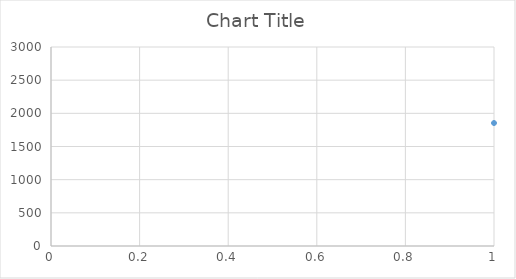
| Category | Series 0 |
|---|---|
| 0 | 1854 |
| 1 | 1859 |
| 2 | 1856 |
| 3 | 1899 |
| 4 | 1923 |
| 5 | 1927 |
| 6 | 1942 |
| 7 | 1959 |
| 8 | 1961 |
| 9 | 1969 |
| 10 | 1943 |
| 11 | 1936 |
| 12 | 1929 |
| 13 | 1915 |
| 14 | 1884 |
| 15 | 1865 |
| 16 | 1877 |
| 17 | 1883 |
| 18 | 1904 |
| 19 | 1916 |
| 20 | 1943 |
| 21 | 1959 |
| 22 | 1964 |
| 23 | 1975 |
| 24 | 1975 |
| 25 | 1976 |
| 26 | 1974 |
| 27 | 1999 |
| 28 | 1987 |
| 29 | 1920 |
| 30 | 1891 |
| 31 | 1886 |
| 32 | 1869 |
| 33 | 1853 |
| 34 | 1851 |
| 35 | 1857 |
| 36 | 1865 |
| 37 | 1874 |
| 38 | 1898 |
| 39 | 1900 |
| 40 | 1909 |
| 41 | 1895 |
| 42 | 1890 |
| 43 | 1916 |
| 44 | 1878 |
| 45 | 1858 |
| 46 | 1833 |
| 47 | 1812 |
| 48 | 1805 |
| 49 | 1791 |
| 50 | 1788 |
| 51 | 1774 |
| 52 | 1776 |
| 53 | 1780 |
| 54 | 1802 |
| 55 | 1821 |
| 56 | 1833 |
| 57 | 1838 |
| 58 | 1836 |
| 59 | 1831 |
| 60 | 1816 |
| 61 | 1807 |
| 62 | 1804 |
| 63 | 1768 |
| 64 | 1737 |
| 65 | 1733 |
| 66 | 1724 |
| 67 | 1722 |
| 68 | 1723 |
| 69 | 1752 |
| 70 | 1776 |
| 71 | 1778 |
| 72 | 1808 |
| 73 | 1810 |
| 74 | 1802 |
| 75 | 1805 |
| 76 | 1790 |
| 77 | 1761 |
| 78 | 1764 |
| 79 | 1782 |
| 80 | 1762 |
| 81 | 1724 |
| 82 | 1721 |
| 83 | 1732 |
| 84 | 1728 |
| 85 | 1735 |
| 86 | 1750 |
| 87 | 1771 |
| 88 | 1791 |
| 89 | 1794 |
| 90 | 1798 |
| 91 | 1805 |
| 92 | 1796 |
| 93 | 1795 |
| 94 | 1776 |
| 95 | 1746 |
| 96 | 1727 |
| 97 | 1718 |
| 98 | 1721 |
| 99 | 1732 |
| 100 | 1735 |
| 101 | 1737 |
| 102 | 1745 |
| 103 | 1761 |
| 104 | 1822 |
| 105 | 1837 |
| 106 | 1832 |
| 107 | 1831 |
| 108 | 1812 |
| 109 | 1801 |
| 110 | 1775 |
| 111 | 1762 |
| 112 | 1739 |
| 113 | 1729 |
| 114 | 1721 |
| 115 | 1716 |
| 116 | 1716 |
| 117 | 1729 |
| 118 | 1758 |
| 119 | 1764 |
| 120 | 1772 |
| 121 | 1784 |
| 122 | 1816 |
| 123 | 1827 |
| 124 | 1827 |
| 125 | 1805 |
| 126 | 1788 |
| 127 | 1782 |
| 128 | 1753 |
| 129 | 1758 |
| 130 | 1733 |
| 131 | 1720 |
| 132 | 1726 |
| 133 | 1765 |
| 134 | 1743 |
| 135 | 1762 |
| 136 | 1785 |
| 137 | 1809 |
| 138 | 1830 |
| 139 | 1819 |
| 140 | 1823 |
| 141 | 1826 |
| 142 | 1810 |
| 143 | 1787 |
| 144 | 1765 |
| 145 | 1739 |
| 146 | 1718 |
| 147 | 1707 |
| 148 | 1691 |
| 149 | 1714 |
| 150 | 1720 |
| 151 | 1721 |
| 152 | 1730 |
| 153 | 1775 |
| 154 | 1810 |
| 155 | 1824 |
| 156 | 1821 |
| 157 | 1815 |
| 158 | 1808 |
| 159 | 1789 |
| 160 | 1782 |
| 161 | 1750 |
| 162 | 1723 |
| 163 | 1713 |
| 164 | 1706 |
| 165 | 1708 |
| 166 | 1719 |
| 167 | 1728 |
| 168 | 1736 |
| 169 | 1756 |
| 170 | 1785 |
| 171 | 1781 |
| 172 | 1794 |
| 173 | 1782 |
| 174 | 1783 |
| 175 | 1772 |
| 176 | 1763 |
| 177 | 1742 |
| 178 | 1719 |
| 179 | 1701 |
| 180 | 1687 |
| 181 | 1692 |
| 182 | 1688 |
| 183 | 1721 |
| 184 | 1710 |
| 185 | 1730 |
| 186 | 1756 |
| 187 | 1790 |
| 188 | 1791 |
| 189 | 1775 |
| 190 | 1774 |
| 191 | 1772 |
| 192 | 1754 |
| 193 | 1736 |
| 194 | 1720 |
| 195 | 1704 |
| 196 | 1674 |
| 197 | 1661 |
| 198 | 1668 |
| 199 | 1679 |
| 200 | 1720 |
| 201 | 1731 |
| 202 | 1731 |
| 203 | 1738 |
| 204 | 1756 |
| 205 | 1766 |
| 206 | 1770 |
| 207 | 1771 |
| 208 | 1749 |
| 209 | 1755 |
| 210 | 1708 |
| 211 | 1708 |
| 212 | 1687 |
| 213 | 1662 |
| 214 | 1676 |
| 215 | 1657 |
| 216 | 1667 |
| 217 | 1686 |
| 218 | 1708 |
| 219 | 1743 |
| 220 | 1747 |
| 221 | 1743 |
| 222 | 1762 |
| 223 | 1765 |
| 224 | 1746 |
| 225 | 1723 |
| 226 | 1713 |
| 227 | 1698 |
| 228 | 1671 |
| 229 | 1654 |
| 230 | 1662 |
| 231 | 1679 |
| 232 | 1671 |
| 233 | 1677 |
| 234 | 1702 |
| 235 | 1718 |
| 236 | 1738 |
| 237 | 1742 |
| 238 | 1737 |
| 239 | 1736 |
| 240 | 1733 |
| 241 | 1721 |
| 242 | 1733 |
| 243 | 1730 |
| 244 | 1714 |
| 245 | 1679 |
| 246 | 1654 |
| 247 | 1649 |
| 248 | 1653 |
| 249 | 1666 |
| 250 | 1686 |
| 251 | 1704 |
| 252 | 1723 |
| 253 | 1735 |
| 254 | 1737 |
| 255 | 1745 |
| 256 | 1750 |
| 257 | 1739 |
| 258 | 1733 |
| 259 | 1712 |
| 260 | 1692 |
| 261 | 1664 |
| 262 | 1632 |
| 263 | 1636 |
| 264 | 1633 |
| 265 | 1661 |
| 266 | 1669 |
| 267 | 1679 |
| 268 | 1691 |
| 269 | 1731 |
| 270 | 1730 |
| 271 | 1729 |
| 272 | 1743 |
| 273 | 1750 |
| 274 | 1737 |
| 275 | 1714 |
| 276 | 1694 |
| 277 | 1667 |
| 278 | 1647 |
| 279 | 1628 |
| 280 | 1646 |
| 281 | 1644 |
| 282 | 1651 |
| 283 | 1667 |
| 284 | 1677 |
| 285 | 1699 |
| 286 | 1734 |
| 287 | 1766 |
| 288 | 1777 |
| 289 | 1758 |
| 290 | 1728 |
| 291 | 1704 |
| 292 | 1705 |
| 293 | 1704 |
| 294 | 1658 |
| 295 | 1655 |
| 296 | 1669 |
| 297 | 1656 |
| 298 | 1658 |
| 299 | 1666 |
| 300 | 1657 |
| 301 | 1683 |
| 302 | 1708 |
| 303 | 1745 |
| 304 | 1739 |
| 305 | 1735 |
| 306 | 1729 |
| 307 | 1707 |
| 308 | 1675 |
| 309 | 1658 |
| 310 | 1660 |
| 311 | 1658 |
| 312 | 1665 |
| 313 | 1658 |
| 314 | 1667 |
| 315 | 1671 |
| 316 | 1685 |
| 317 | 1696 |
| 318 | 1716 |
| 319 | 1720 |
| 320 | 1743 |
| 321 | 1772 |
| 322 | 1775 |
| 323 | 1771 |
| 324 | 1766 |
| 325 | 1735 |
| 326 | 1748 |
| 327 | 1738 |
| 328 | 1725 |
| 329 | 1705 |
| 330 | 1724 |
| 331 | 1747 |
| 332 | 1759 |
| 333 | 1780 |
| 334 | 1807 |
| 335 | 1812 |
| 336 | 1825 |
| 337 | 1838 |
| 338 | 1838 |
| 339 | 1854 |
| 340 | 1849 |
| 341 | 1845 |
| 342 | 1819 |
| 343 | 1812 |
| 344 | 1793 |
| 345 | 1783 |
| 346 | 1799 |
| 347 | 1804 |
| 348 | 1805 |
| 349 | 1814 |
| 350 | 1814 |
| 351 | 1885 |
| 352 | 1838 |
| 353 | 1855 |
| 354 | 1836 |
| 355 | 1823 |
| 356 | 1791 |
| 357 | 1776 |
| 358 | 1739 |
| 359 | 1735 |
| 360 | 1745 |
| 361 | 1701 |
| 362 | 1683 |
| 363 | 1696 |
| 364 | 1732 |
| 365 | 1727 |
| 366 | 1759 |
| 367 | 1766 |
| 368 | 1775 |
| 369 | 1786 |
| 370 | 1787 |
| 371 | 1758 |
| 372 | 1754 |
| 373 | 1721 |
| 374 | 1691 |
| 375 | 1671 |
| 376 | 1650 |
| 377 | 1630 |
| 378 | 1626 |
| 379 | 1610 |
| 380 | 1633 |
| 381 | 1625 |
| 382 | 1644 |
| 383 | 1668 |
| 384 | 1693 |
| 385 | 1695 |
| 386 | 1700 |
| 387 | 1700 |
| 388 | 1694 |
| 389 | 1696 |
| 390 | 1668 |
| 391 | 1649 |
| 392 | 1617 |
| 393 | 1600 |
| 394 | 1600 |
| 395 | 1608 |
| 396 | 1605 |
| 397 | 1630 |
| 398 | 1640 |
| 399 | 1643 |
| 400 | 1655 |
| 401 | 1669 |
| 402 | 1678 |
| 403 | 1694 |
| 404 | 1712 |
| 405 | 1700 |
| 406 | 1694 |
| 407 | 1667 |
| 408 | 1646 |
| 409 | 1630 |
| 410 | 1606 |
| 411 | 1592 |
| 412 | 1584 |
| 413 | 1611 |
| 414 | 1607 |
| 415 | 1626 |
| 416 | 1653 |
| 417 | 1673 |
| 418 | 1691 |
| 419 | 1698 |
| 420 | 1678 |
| 421 | 1679 |
| 422 | 1671 |
| 423 | 1659 |
| 424 | 1646 |
| 425 | 1613 |
| 426 | 1598 |
| 427 | 1595 |
| 428 | 1584 |
| 429 | 1584 |
| 430 | 1613 |
| 431 | 1662 |
| 432 | 1663 |
| 433 | 1713 |
| 434 | 1726 |
| 435 | 1737 |
| 436 | 1775 |
| 437 | 1796 |
| 438 | 1803 |
| 439 | 1828 |
| 440 | 1897 |
| 441 | 1934 |
| 442 | 1965 |
| 443 | 2027 |
| 444 | 2104 |
| 445 | 2174 |
| 446 | 2248 |
| 447 | 2318 |
| 448 | 2404 |
| 449 | 2513 |
| 450 | 2580 |
| 451 | 2679 |
| 452 | 2783 |
| 453 | 2833 |
| 454 | 2845 |
| 455 | 2800 |
| 456 | 2700 |
| 457 | 2592 |
| 458 | 2484 |
| 459 | 2386 |
| 460 | 2223 |
| 461 | 2074 |
| 462 | 1942 |
| 463 | 1839 |
| 464 | 1782 |
| 465 | 1751 |
| 466 | 1729 |
| 467 | 1757 |
| 468 | 1788 |
| 469 | 1783 |
| 470 | 1777 |
| 471 | 1779 |
| 472 | 1789 |
| 473 | 1798 |
| 474 | 1778 |
| 475 | 1745 |
| 476 | 1722 |
| 477 | 1716 |
| 478 | 1723 |
| 479 | 1737 |
| 480 | 1750 |
| 481 | 1762 |
| 482 | 1782 |
| 483 | 1799 |
| 484 | 1818 |
| 485 | 1820 |
| 486 | 1814 |
| 487 | 1807 |
| 488 | 1788 |
| 489 | 1779 |
| 490 | 1765 |
| 491 | 1743 |
| 492 | 1725 |
| 493 | 1708 |
| 494 | 1697 |
| 495 | 1692 |
| 496 | 1704 |
| 497 | 1717 |
| 498 | 1729 |
| 499 | 1759 |
| 500 | 1760 |
| 501 | 1778 |
| 502 | 1780 |
| 503 | 1779 |
| 504 | 1769 |
| 505 | 1760 |
| 506 | 1739 |
| 507 | 1719 |
| 508 | 1708 |
| 509 | 1698 |
| 510 | 1680 |
| 511 | 1676 |
| 512 | 1692 |
| 513 | 1706 |
| 514 | 1743 |
| 515 | 1760 |
| 516 | 1771 |
| 517 | 1781 |
| 518 | 1782 |
| 519 | 1783 |
| 520 | 1770 |
| 521 | 1782 |
| 522 | 1766 |
| 523 | 1721 |
| 524 | 1696 |
| 525 | 1688 |
| 526 | 1683 |
| 527 | 1679 |
| 528 | 1700 |
| 529 | 1717 |
| 530 | 1728 |
| 531 | 1742 |
| 532 | 1735 |
| 533 | 1764 |
| 534 | 1772 |
| 535 | 1779 |
| 536 | 1789 |
| 537 | 1789 |
| 538 | 1777 |
| 539 | 1752 |
| 540 | 1720 |
| 541 | 1712 |
| 542 | 1703 |
| 543 | 1707 |
| 544 | 1706 |
| 545 | 1714 |
| 546 | 1738 |
| 547 | 1733 |
| 548 | 1755 |
| 549 | 1783 |
| 550 | 1803 |
| 551 | 1798 |
| 552 | 1791 |
| 553 | 1792 |
| 554 | 1789 |
| 555 | 1775 |
| 556 | 1755 |
| 557 | 1742 |
| 558 | 1729 |
| 559 | 1719 |
| 560 | 1725 |
| 561 | 1714 |
| 562 | 1742 |
| 563 | 1771 |
| 564 | 1785 |
| 565 | 1787 |
| 566 | 1810 |
| 567 | 1827 |
| 568 | 1821 |
| 569 | 1820 |
| 570 | 1799 |
| 571 | 1779 |
| 572 | 1762 |
| 573 | 1766 |
| 574 | 1774 |
| 575 | 1754 |
| 576 | 1730 |
| 577 | 1729 |
| 578 | 1745 |
| 579 | 1770 |
| 580 | 1779 |
| 581 | 1813 |
| 582 | 1833 |
| 583 | 1832 |
| 584 | 1841 |
| 585 | 1849 |
| 586 | 1849 |
| 587 | 1851 |
| 588 | 1817 |
| 589 | 1820 |
| 590 | 1795 |
| 591 | 1783 |
| 592 | 1761 |
| 593 | 1752 |
| 594 | 1754 |
| 595 | 1770 |
| 596 | 1791 |
| 597 | 1804 |
| 598 | 1835 |
| 599 | 1844 |
| 600 | 1867 |
| 601 | 1882 |
| 602 | 1869 |
| 603 | 1855 |
| 604 | 1828 |
| 605 | 1822 |
| 606 | 1800 |
| 607 | 1769 |
| 608 | 1766 |
| 609 | 1795 |
| 610 | 1793 |
| 611 | 1798 |
| 612 | 1820 |
| 613 | 1828 |
| 614 | 1865 |
| 615 | 1882 |
| 616 | 1889 |
| 617 | 1898 |
| 618 | 1899 |
| 619 | 1888 |
| 620 | 1875 |
| 621 | 1852 |
| 622 | 1845 |
| 623 | 1842 |
| 624 | 1843 |
| 625 | 1822 |
| 626 | 1819 |
| 627 | 1836 |
| 628 | 1817 |
| 629 | 1841 |
| 630 | 1872 |
| 631 | 1891 |
| 632 | 1904 |
| 633 | 1929 |
| 634 | 1950 |
| 635 | 1948 |
| 636 | 1938 |
| 637 | 1912 |
| 638 | 1890 |
| 639 | 1867 |
| 640 | 1852 |
| 641 | 1849 |
| 642 | 1842 |
| 643 | 1845 |
| 644 | 1855 |
| 645 | 1867 |
| 646 | 1885 |
| 647 | 1903 |
| 648 | 1928 |
| 649 | 1946 |
| 650 | 1961 |
| 651 | 1949 |
| 652 | 1949 |
| 653 | 1941 |
| 654 | 1924 |
| 655 | 1900 |
| 656 | 1871 |
| 657 | 1847 |
| 658 | 1837 |
| 659 | 1848 |
| 660 | 1887 |
| 661 | 1903 |
| 662 | 1935 |
| 663 | 1939 |
| 664 | 1932 |
| 665 | 1952 |
| 666 | 1945 |
| 667 | 1942 |
| 668 | 1945 |
| 669 | 1920 |
| 670 | 1891 |
| 671 | 1878 |
| 672 | 1866 |
| 673 | 1836 |
| 674 | 1828 |
| 675 | 1817 |
| 676 | 1816 |
| 677 | 1816 |
| 678 | 1825 |
| 679 | 1827 |
| 680 | 1836 |
| 681 | 1849 |
| 682 | 1851 |
| 683 | 1848 |
| 684 | 1846 |
| 685 | 1835 |
| 686 | 1791 |
| 687 | 1775 |
| 688 | 1765 |
| 689 | 1745 |
| 690 | 1720 |
| 691 | 1700 |
| 692 | 1707 |
| 693 | 1720 |
| 694 | 1716 |
| 695 | 1727 |
| 696 | 1741 |
| 697 | 1737 |
| 698 | 1755 |
| 699 | 1764 |
| 700 | 1755 |
| 701 | 1765 |
| 702 | 1771 |
| 703 | 1733 |
| 704 | 1706 |
| 705 | 1683 |
| 706 | 1660 |
| 707 | 1650 |
| 708 | 1664 |
| 709 | 1666 |
| 710 | 1653 |
| 711 | 1667 |
| 712 | 1694 |
| 713 | 1701 |
| 714 | 1703 |
| 715 | 1726 |
| 716 | 1721 |
| 717 | 1728 |
| 718 | 1720 |
| 719 | 1702 |
| 720 | 1697 |
| 721 | 1678 |
| 722 | 1661 |
| 723 | 1646 |
| 724 | 1632 |
| 725 | 1637 |
| 726 | 1652 |
| 727 | 1659 |
| 728 | 1659 |
| 729 | 1675 |
| 730 | 1716 |
| 731 | 1745 |
| 732 | 1736 |
| 733 | 1733 |
| 734 | 1726 |
| 735 | 1703 |
| 736 | 1685 |
| 737 | 1667 |
| 738 | 1641 |
| 739 | 1631 |
| 740 | 1645 |
| 741 | 1643 |
| 742 | 1650 |
| 743 | 1657 |
| 744 | 1671 |
| 745 | 1683 |
| 746 | 1698 |
| 747 | 1717 |
| 748 | 1735 |
| 749 | 1741 |
| 750 | 1722 |
| 751 | 1716 |
| 752 | 1727 |
| 753 | 1714 |
| 754 | 1708 |
| 755 | 1677 |
| 756 | 1648 |
| 757 | 1645 |
| 758 | 1642 |
| 759 | 1637 |
| 760 | 1656 |
| 761 | 1690 |
| 762 | 1722 |
| 763 | 1741 |
| 764 | 1730 |
| 765 | 1740 |
| 766 | 1746 |
| 767 | 1735 |
| 768 | 1714 |
| 769 | 1716 |
| 770 | 1687 |
| 771 | 1660 |
| 772 | 1646 |
| 773 | 1634 |
| 774 | 1643 |
| 775 | 1645 |
| 776 | 1650 |
| 777 | 1687 |
| 778 | 1719 |
| 779 | 1729 |
| 780 | 1733 |
| 781 | 1737 |
| 782 | 1752 |
| 783 | 1750 |
| 784 | 1721 |
| 785 | 1704 |
| 786 | 1683 |
| 787 | 1660 |
| 788 | 1641 |
| 789 | 1637 |
| 790 | 1643 |
| 791 | 1637 |
| 792 | 1647 |
| 793 | 1667 |
| 794 | 1682 |
| 795 | 1705 |
| 796 | 1717 |
| 797 | 1719 |
| 798 | 1720 |
| 799 | 1730 |
| 800 | 1713 |
| 801 | 1711 |
| 802 | 1685 |
| 803 | 1664 |
| 804 | 1656 |
| 805 | 1637 |
| 806 | 1639 |
| 807 | 1620 |
| 808 | 1641 |
| 809 | 1647 |
| 810 | 1657 |
| 811 | 1729 |
| 812 | 1702 |
| 813 | 1718 |
| 814 | 1721 |
| 815 | 1717 |
| 816 | 1707 |
| 817 | 1691 |
| 818 | 1713 |
| 819 | 1695 |
| 820 | 1660 |
| 821 | 1637 |
| 822 | 1623 |
| 823 | 1632 |
| 824 | 1633 |
| 825 | 1627 |
| 826 | 1635 |
| 827 | 1662 |
| 828 | 1673 |
| 829 | 1700 |
| 830 | 1717 |
| 831 | 1730 |
| 832 | 1713 |
| 833 | 1700 |
| 834 | 1689 |
| 835 | 1665 |
| 836 | 1636 |
| 837 | 1622 |
| 838 | 1611 |
| 839 | 1611 |
| 840 | 1611 |
| 841 | 1640 |
| 842 | 1658 |
| 843 | 1662 |
| 844 | 1672 |
| 845 | 1687 |
| 846 | 1704 |
| 847 | 1706 |
| 848 | 1708 |
| 849 | 1696 |
| 850 | 1691 |
| 851 | 1672 |
| 852 | 1654 |
| 853 | 1621 |
| 854 | 1600 |
| 855 | 1590 |
| 856 | 1607 |
| 857 | 1625 |
| 858 | 1646 |
| 859 | 1650 |
| 860 | 1678 |
| 861 | 1679 |
| 862 | 1704 |
| 863 | 1698 |
| 864 | 1662 |
| 865 | 1683 |
| 866 | 1693 |
| 867 | 1664 |
| 868 | 1646 |
| 869 | 1637 |
| 870 | 1631 |
| 871 | 1618 |
| 872 | 1617 |
| 873 | 1625 |
| 874 | 1619 |
| 875 | 1642 |
| 876 | 1638 |
| 877 | 1659 |
| 878 | 1685 |
| 879 | 1696 |
| 880 | 1696 |
| 881 | 1698 |
| 882 | 1710 |
| 883 | 1697 |
| 884 | 1675 |
| 885 | 1640 |
| 886 | 1617 |
| 887 | 1610 |
| 888 | 1597 |
| 889 | 1593 |
| 890 | 1598 |
| 891 | 1617 |
| 892 | 1621 |
| 893 | 1637 |
| 894 | 1647 |
| 895 | 1696 |
| 896 | 1700 |
| 897 | 1696 |
| 898 | 1695 |
| 899 | 1681 |
| 900 | 1663 |
| 901 | 1648 |
| 902 | 1630 |
| 903 | 1611 |
| 904 | 1597 |
| 905 | 1582 |
| 906 | 1592 |
| 907 | 1596 |
| 908 | 1606 |
| 909 | 1658 |
| 910 | 1679 |
| 911 | 1687 |
| 912 | 1704 |
| 913 | 1688 |
| 914 | 1695 |
| 915 | 1689 |
| 916 | 1678 |
| 917 | 1660 |
| 918 | 1633 |
| 919 | 1620 |
| 920 | 1598 |
| 921 | 1598 |
| 922 | 1591 |
| 923 | 1606 |
| 924 | 1609 |
| 925 | 1619 |
| 926 | 1634 |
| 927 | 1643 |
| 928 | 1679 |
| 929 | 1717 |
| 930 | 1697 |
| 931 | 1694 |
| 932 | 1688 |
| 933 | 1682 |
| 934 | 1666 |
| 935 | 1633 |
| 936 | 1604 |
| 937 | 1589 |
| 938 | 1576 |
| 939 | 1580 |
| 940 | 1585 |
| 941 | 1613 |
| 942 | 1670 |
| 943 | 1673 |
| 944 | 1671 |
| 945 | 1676 |
| 946 | 1685 |
| 947 | 1675 |
| 948 | 1679 |
| 949 | 1653 |
| 950 | 1643 |
| 951 | 1630 |
| 952 | 1630 |
| 953 | 1600 |
| 954 | 1585 |
| 955 | 1590 |
| 956 | 1606 |
| 957 | 1621 |
| 958 | 1623 |
| 959 | 1642 |
| 960 | 1653 |
| 961 | 1658 |
| 962 | 1685 |
| 963 | 1687 |
| 964 | 1674 |
| 965 | 1683 |
| 966 | 1672 |
| 967 | 1643 |
| 968 | 1617 |
| 969 | 1600 |
| 970 | 1597 |
| 971 | 1581 |
| 972 | 1596 |
| 973 | 1600 |
| 974 | 1613 |
| 975 | 1645 |
| 976 | 1662 |
| 977 | 1687 |
| 978 | 1708 |
| 979 | 1710 |
| 980 | 1695 |
| 981 | 1685 |
| 982 | 1691 |
| 983 | 1684 |
| 984 | 1681 |
| 985 | 1683 |
| 986 | 1670 |
| 987 | 1657 |
| 988 | 1647 |
| 989 | 1658 |
| 990 | 1676 |
| 991 | 1710 |
| 992 | 1738 |
| 993 | 1745 |
| 994 | 1771 |
| 995 | 1791 |
| 996 | 1791 |
| 997 | 1785 |
| 998 | 1788 |
| 999 | 1791 |
| 1000 | 1775 |
| 1001 | 1752 |
| 1002 | 1755 |
| 1003 | 1740 |
| 1004 | 1745 |
| 1005 | 1748 |
| 1006 | 1749 |
| 1007 | 1767 |
| 1008 | 1762 |
| 1009 | 1772 |
| 1010 | 1790 |
| 1011 | 1808 |
| 1012 | 1832 |
| 1013 | 1830 |
| 1014 | 1795 |
| 1015 | 1778 |
| 1016 | 1744 |
| 1017 | 1704 |
| 1018 | 1726 |
| 1019 | 1685 |
| 1020 | 1671 |
| 1021 | 1670 |
| 1022 | 1667 |
| 1023 | 1674 |
| 1024 | 1679 |
| 1025 | 1733 |
| 1026 | 1745 |
| 1027 | 1749 |
| 1028 | 1751 |
| 1029 | 1744 |
| 1030 | 1734 |
| 1031 | 1712 |
| 1032 | 1688 |
| 1033 | 1655 |
| 1034 | 1640 |
| 1035 | 1612 |
| 1036 | 1597 |
| 1037 | 1584 |
| 1038 | 1592 |
| 1039 | 1595 |
| 1040 | 1604 |
| 1041 | 1613 |
| 1042 | 1631 |
| 1043 | 1642 |
| 1044 | 1648 |
| 1045 | 1662 |
| 1046 | 1650 |
| 1047 | 1632 |
| 1048 | 1637 |
| 1049 | 1663 |
| 1050 | 1614 |
| 1051 | 1575 |
| 1052 | 1572 |
| 1053 | 1577 |
| 1054 | 1567 |
| 1055 | 1566 |
| 1056 | 1578 |
| 1057 | 1604 |
| 1058 | 1619 |
| 1059 | 1653 |
| 1060 | 1646 |
| 1061 | 1654 |
| 1062 | 1650 |
| 1063 | 1637 |
| 1064 | 1634 |
| 1065 | 1630 |
| 1066 | 1596 |
| 1067 | 1566 |
| 1068 | 1559 |
| 1069 | 1550 |
| 1070 | 1532 |
| 1071 | 1536 |
| 1072 | 1550 |
| 1073 | 1578 |
| 1074 | 1611 |
| 1075 | 1639 |
| 1076 | 1638 |
| 1077 | 1641 |
| 1078 | 1643 |
| 1079 | 1640 |
| 1080 | 1621 |
| 1081 | 1609 |
| 1082 | 1602 |
| 1083 | 1579 |
| 1084 | 1558 |
| 1085 | 1555 |
| 1086 | 1546 |
| 1087 | 1542 |
| 1088 | 1546 |
| 1089 | 1553 |
| 1090 | 1560 |
| 1091 | 1596 |
| 1092 | 1622 |
| 1093 | 1652 |
| 1094 | 1668 |
| 1095 | 1667 |
| 1096 | 1678 |
| 1097 | 1693 |
| 1098 | 1690 |
| 1099 | 1705 |
| 1100 | 1740 |
| 1101 | 1791 |
| 1102 | 1833 |
| 1103 | 1908 |
| 1104 | 1991 |
| 1105 | 2098 |
| 1106 | 2206 |
| 1107 | 2277 |
| 1108 | 2360 |
| 1109 | 2426 |
| 1110 | 2497 |
| 1111 | 2558 |
| 1112 | 2642 |
| 1113 | 2720 |
| 1114 | 2779 |
| 1115 | 2776 |
| 1116 | 2699 |
| 1117 | 2610 |
| 1118 | 2492 |
| 1119 | 2397 |
| 1120 | 2284 |
| 1121 | 2144 |
| 1122 | 2004 |
| 1123 | 1911 |
| 1124 | 1839 |
| 1125 | 1812 |
| 1126 | 1758 |
| 1127 | 1737 |
| 1128 | 1754 |
| 1129 | 1723 |
| 1130 | 1707 |
| 1131 | 1694 |
| 1132 | 1699 |
| 1133 | 1704 |
| 1134 | 1688 |
| 1135 | 1678 |
| 1136 | 1683 |
| 1137 | 1677 |
| 1138 | 1679 |
| 1139 | 1700 |
| 1140 | 1709 |
| 1141 | 1743 |
| 1142 | 1781 |
| 1143 | 1787 |
| 1144 | 1775 |
| 1145 | 1762 |
| 1146 | 1746 |
| 1147 | 1724 |
| 1148 | 1698 |
| 1149 | 1665 |
| 1150 | 1659 |
| 1151 | 1653 |
| 1152 | 1646 |
| 1153 | 1626 |
| 1154 | 1639 |
| 1155 | 1637 |
| 1156 | 1666 |
| 1157 | 1692 |
| 1158 | 1697 |
| 1159 | 1702 |
| 1160 | 1700 |
| 1161 | 1713 |
| 1162 | 1676 |
| 1163 | 1685 |
| 1164 | 1675 |
| 1165 | 1655 |
| 1166 | 1629 |
| 1167 | 1630 |
| 1168 | 1627 |
| 1169 | 1607 |
| 1170 | 1606 |
| 1171 | 1630 |
| 1172 | 1651 |
| 1173 | 1665 |
| 1174 | 1675 |
| 1175 | 1696 |
| 1176 | 1700 |
| 1177 | 1707 |
| 1178 | 1694 |
| 1179 | 1677 |
| 1180 | 1668 |
| 1181 | 1633 |
| 1182 | 1627 |
| 1183 | 1614 |
| 1184 | 1615 |
| 1185 | 1610 |
| 1186 | 1600 |
| 1187 | 1617 |
| 1188 | 1635 |
| 1189 | 1649 |
| 1190 | 1683 |
| 1191 | 1694 |
| 1192 | 1716 |
| 1193 | 1711 |
| 1194 | 1708 |
| 1195 | 1697 |
| 1196 | 1678 |
| 1197 | 1671 |
| 1198 | 1630 |
| 1199 | 1626 |
| 1200 | 1610 |
| 1201 | 1608 |
| 1202 | 1600 |
| 1203 | 1629 |
| 1204 | 1639 |
| 1205 | 1643 |
| 1206 | 1659 |
| 1207 | 1669 |
| 1208 | 1687 |
| 1209 | 1694 |
| 1210 | 1702 |
| 1211 | 1692 |
| 1212 | 1680 |
| 1213 | 1663 |
| 1214 | 1653 |
| 1215 | 1625 |
| 1216 | 1617 |
| 1217 | 1606 |
| 1218 | 1617 |
| 1219 | 1614 |
| 1220 | 1635 |
| 1221 | 1650 |
| 1222 | 1661 |
| 1223 | 1654 |